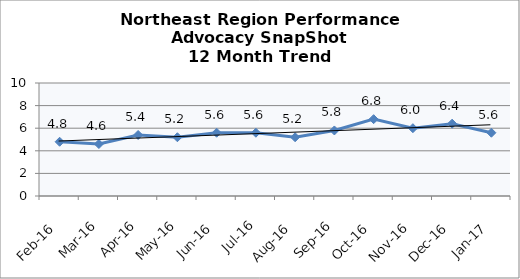
| Category | Northeast Region |
|---|---|
| Feb-16 | 4.8 |
| Mar-16 | 4.6 |
| Apr-16 | 5.4 |
| May-16 | 5.2 |
| Jun-16 | 5.6 |
| Jul-16 | 5.6 |
| Aug-16 | 5.2 |
| Sep-16 | 5.8 |
| Oct-16 | 6.8 |
| Nov-16 | 6 |
| Dec-16 | 6.4 |
| Jan-17 | 5.6 |